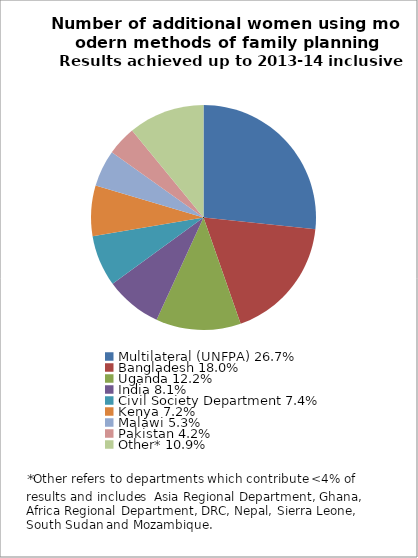
| Category | Series 0 |
|---|---|
| Multilateral (UNFPA) 26.7% | 26.668 |
| Bangladesh 18.0% | 17.979 |
| Uganda 12.2% | 12.198 |
| India 8.1% | 8.131 |
| Civil Society Department 7.4% | 7.362 |
| Kenya 7.2% | 7.237 |
| Malawi 5.3% | 5.27 |
| Pakistan 4.2% | 4.206 |
| Other* 10.9% | 10.948 |